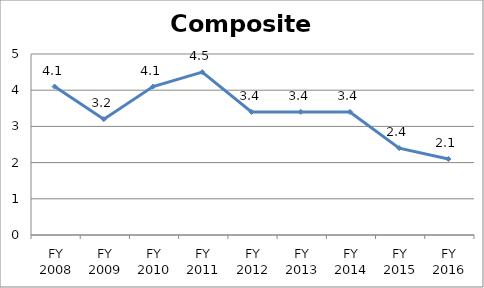
| Category | Composite score |
|---|---|
| FY 2016 | 2.1 |
| FY 2015 | 2.4 |
| FY 2014 | 3.4 |
| FY 2013 | 3.4 |
| FY 2012 | 3.4 |
| FY 2011 | 4.5 |
| FY 2010 | 4.1 |
| FY 2009 | 3.2 |
| FY 2008 | 4.1 |